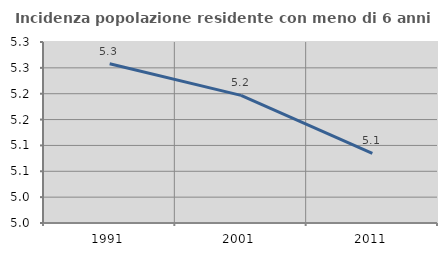
| Category | Incidenza popolazione residente con meno di 6 anni |
|---|---|
| 1991.0 | 5.258 |
| 2001.0 | 5.197 |
| 2011.0 | 5.085 |